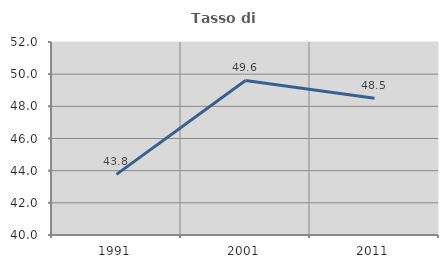
| Category | Tasso di occupazione   |
|---|---|
| 1991.0 | 43.772 |
| 2001.0 | 49.609 |
| 2011.0 | 48.499 |